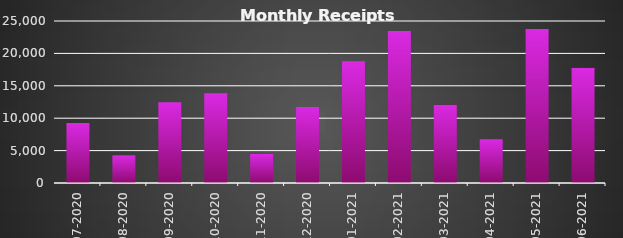
| Category |  Receipts  |
|---|---|
| 2020-07-31 | 9250 |
| 2020-08-31 | 4270 |
| 2020-09-30 | 12480 |
| 2020-10-31 | 13845 |
| 2020-11-30 | 4500 |
| 2020-12-31 | 11735 |
| 2021-01-31 | 18792 |
| 2021-02-28 | 23454 |
| 2021-03-31 | 12080 |
| 2021-04-30 | 6750 |
| 2021-05-31 | 23750 |
| 2021-06-30 | 17790 |